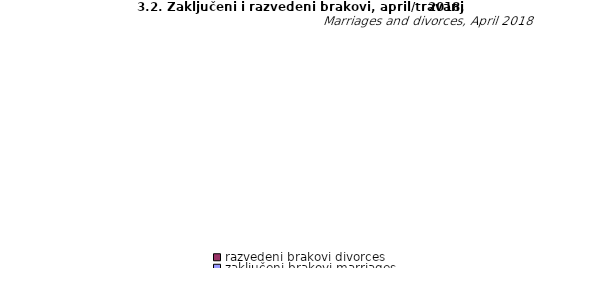
| Category | zaključeni brakovi marriages | razvedeni brakovi divorces |
|---|---|---|
| Unsko - sanski | 156 | 21 |
| Kanton Posavski | 14 | 7 |
| Tuzlanski | 243 | 29 |
| Zeničko - dobojski | 206 | 15 |
| Bosansko - podrinjski | 12 | 2 |
| Srednjobosanski | 116 | 13 |
| Hercegovačko-
neretvanski | 114 | 18 |
| Zapadnohercegovački | 71 | 2 |
| Kanton Sarajevo | 232 | 16 |
| Kanton 10 | 31 | 3 |